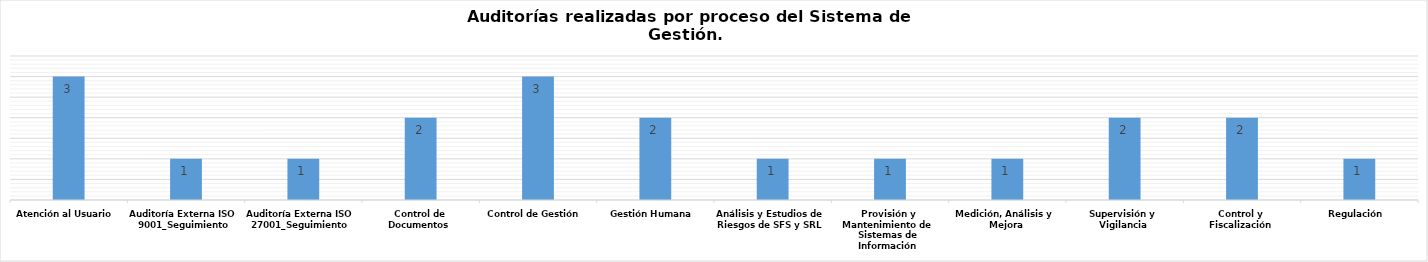
| Category | Total |
|---|---|
| Atención al Usuario | 3 |
| Auditoría Externa ISO 9001_Seguimiento | 1 |
| Auditoría Externa ISO 27001_Seguimiento | 1 |
| Control de Documentos | 2 |
| Control de Gestión | 3 |
| Gestión Humana | 2 |
| Análisis y Estudios de Riesgos de SFS y SRL | 1 |
| Provisión y Mantenimiento de Sistemas de Información | 1 |
| Medición, Análisis y Mejora | 1 |
| Supervisión y Vigilancia | 2 |
| Control y Fiscalización | 2 |
| Regulación | 1 |